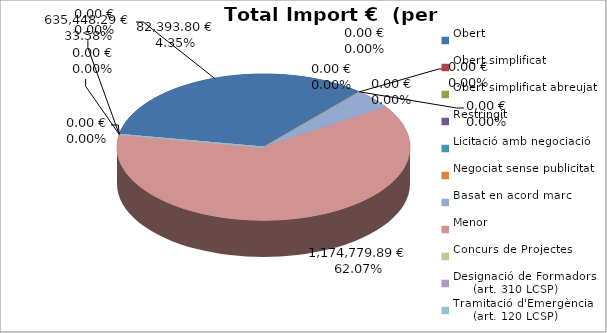
| Category | Total preu
(amb IVA) |
|---|---|
| Obert | 635448.29 |
| Obert simplificat | 0 |
| Obert simplificat abreujat | 0 |
| Restringit | 0 |
| Licitació amb negociació | 0 |
| Negociat sense publicitat | 0 |
| Basat en acord marc | 82393.8 |
| Menor | 1174779.89 |
| Concurs de Projectes | 0 |
| Designació de Formadors
     (art. 310 LCSP) | 0 |
| Tramitació d'Emergència
     (art. 120 LCSP) | 0 |